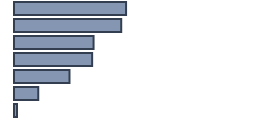
| Category | Percentatge |
|---|---|
| 0 | 46.695 |
| 1 | 44.674 |
| 2 | 33.151 |
| 3 | 32.557 |
| 4 | 23.122 |
| 5 | 10.15 |
| 6 | 1.265 |